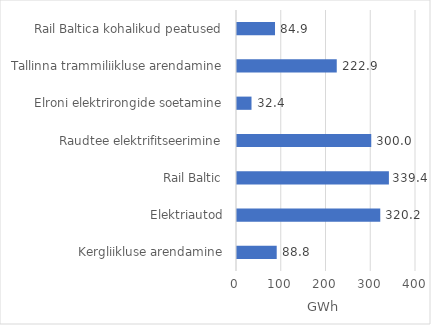
| Category | Series 0 |
|---|---|
| Kergliikluse arendamine | 88.75 |
| Elektriautod | 320.155 |
| Rail Baltic | 339.444 |
| Raudtee elektrifitseerimine | 300.022 |
| Elroni elektrirongide soetamine | 32.407 |
| Tallinna trammiliikluse arendamine | 222.916 |
| Rail Baltica kohalikud peatused | 84.936 |